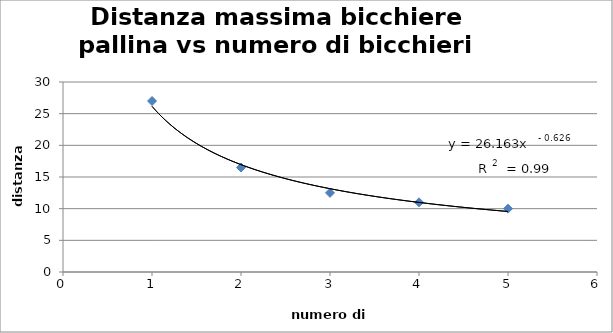
| Category | Series 0 |
|---|---|
| 1.0 | 27 |
| 2.0 | 16.5 |
| 3.0 | 12.5 |
| 4.0 | 11 |
| 5.0 | 10 |